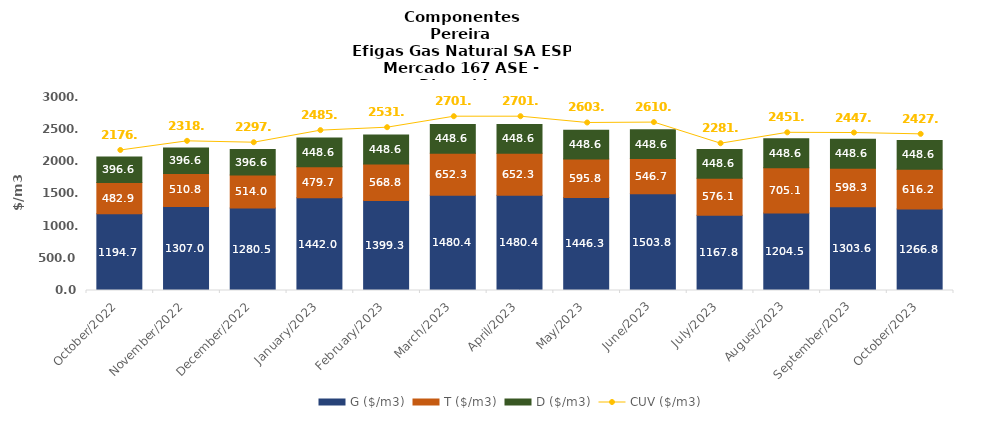
| Category | G ($/m3) | T ($/m3) | D ($/m3) |
|---|---|---|---|
| 2022-10-01 | 1194.65 | 482.93 | 396.6 |
| 2022-11-01 | 1306.98 | 510.84 | 396.6 |
| 2022-12-01 | 1280.49 | 513.98 | 396.6 |
| 2023-01-01 | 1442 | 479.72 | 448.63 |
| 2023-02-01 | 1399.342 | 568.805 | 448.635 |
| 2023-03-01 | 1480.39 | 652.25 | 448.635 |
| 2023-04-01 | 1480.39 | 652.25 | 448.635 |
| 2023-05-01 | 1446.347 | 595.782 | 448.635 |
| 2023-06-01 | 1503.75 | 546.731 | 448.635 |
| 2023-07-01 | 1167.85 | 576.067 | 448.635 |
| 2023-08-01 | 1204.533 | 705.123 | 448.635 |
| 2023-09-01 | 1303.571 | 598.275 | 448.635 |
| 2023-10-01 | 1266.828 | 616.197 | 448.635 |